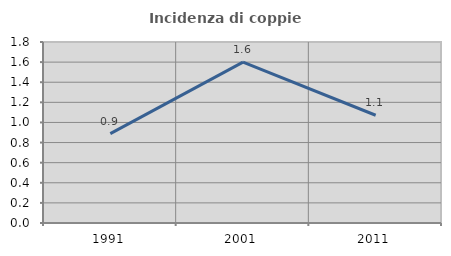
| Category | Incidenza di coppie miste |
|---|---|
| 1991.0 | 0.889 |
| 2001.0 | 1.6 |
| 2011.0 | 1.071 |